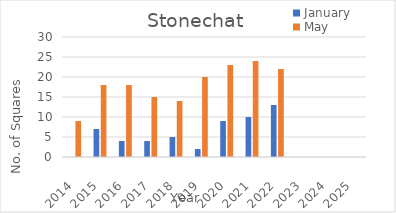
| Category | January | May |
|---|---|---|
| 2014.0 | 0 | 9 |
| 2015.0 | 7 | 18 |
| 2016.0 | 4 | 18 |
| 2017.0 | 4 | 15 |
| 2018.0 | 5 | 14 |
| 2019.0 | 2 | 20 |
| 2020.0 | 9 | 23 |
| 2021.0 | 10 | 24 |
| 2022.0 | 13 | 22 |
| 2023.0 | 0 | 0 |
| 2024.0 | 0 | 0 |
| 2025.0 | 0 | 0 |